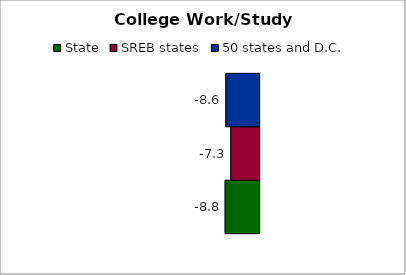
| Category | State | SREB states | 50 states and D.C. |
|---|---|---|---|
| 0 | -8.775 | -7.32 | -8.596 |